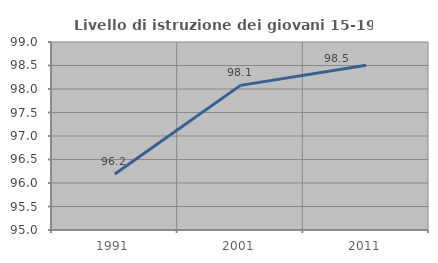
| Category | Livello di istruzione dei giovani 15-19 anni |
|---|---|
| 1991.0 | 96.19 |
| 2001.0 | 98.077 |
| 2011.0 | 98.507 |